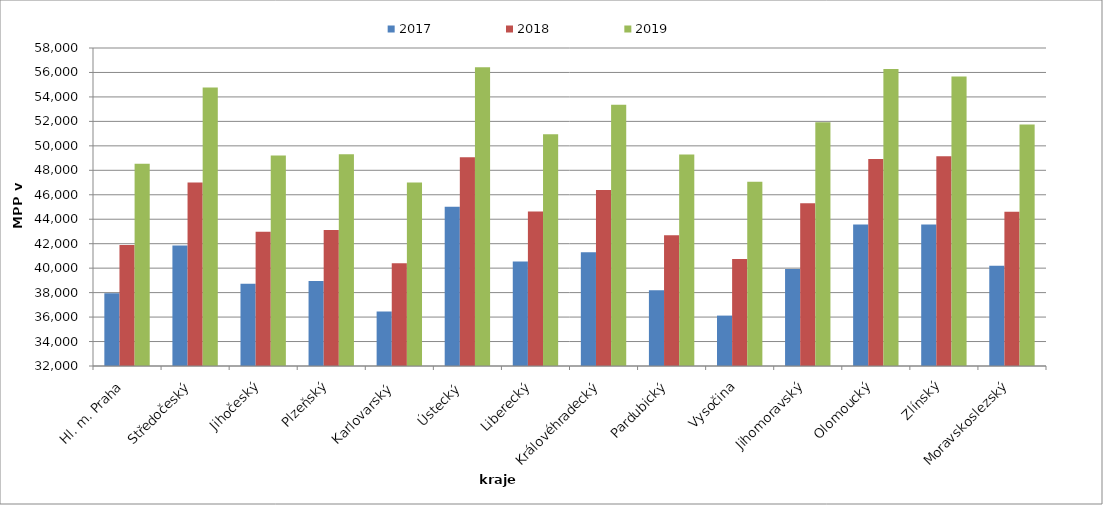
| Category | 2017 | 2018 | 2019 |
|---|---|---|---|
| Hl. m. Praha | 37944.272 | 41894.737 | 48532.508 |
| Středočeský | 41843.399 | 47006.982 | 54760.847 |
| Jihočeský | 38716.635 | 42976.067 | 49207.007 |
| Plzeňský | 38950.162 | 43118.447 | 49320.388 |
| Karlovarský  | 36456.018 | 40393.776 | 46999.047 |
| Ústecký   | 45011.024 | 49061.417 | 56420.472 |
| Liberecký | 40541.182 | 44622.336 | 50956.493 |
| Královéhradecký | 41304.248 | 46393.571 | 53352.468 |
| Pardubický | 38189.991 | 42692.811 | 49284.417 |
| Vysočina | 36120.809 | 40744.186 | 47060.103 |
| Jihomoravský | 39928.989 | 45314.157 | 51937.079 |
| Olomoucký | 43574.742 | 48934.099 | 56274.627 |
| Zlínský | 43575.163 | 49149.315 | 55660.861 |
| Moravskoslezský | 40206.055 | 44613.083 | 51747.041 |